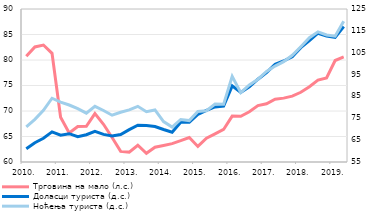
| Category | Трговина на мало (л.с.) |
|---|---|
| 2010. | 80.735 |
| II | 82.561 |
| III | 82.932 |
| IV | 81.311 |
| 2011. | 68.78 |
| II | 65.697 |
| III | 66.973 |
| IV | 66.991 |
| 2012. | 69.484 |
| II | 67.398 |
| III | 64.804 |
| IV | 62.079 |
| 2013. | 61.944 |
| II | 63.289 |
| III | 61.711 |
| IV | 62.908 |
| 2014. | 63.241 |
| II | 63.606 |
| III | 64.175 |
| IV | 64.792 |
| 2015. | 63.054 |
| II | 64.659 |
| III | 65.507 |
| IV | 66.382 |
| 2016. | 69.004 |
| II | 68.963 |
| III | 69.851 |
| IV | 71.056 |
| 2017. | 71.429 |
| II | 72.321 |
| III | 72.521 |
| IV | 72.909 |
| 2018. | 73.669 |
| II | 74.753 |
| III | 76.047 |
| IV | 76.483 |
| 2019. | 79.898 |
| II | 80.601 |